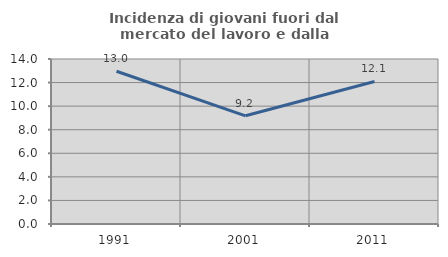
| Category | Incidenza di giovani fuori dal mercato del lavoro e dalla formazione  |
|---|---|
| 1991.0 | 12.963 |
| 2001.0 | 9.179 |
| 2011.0 | 12.093 |